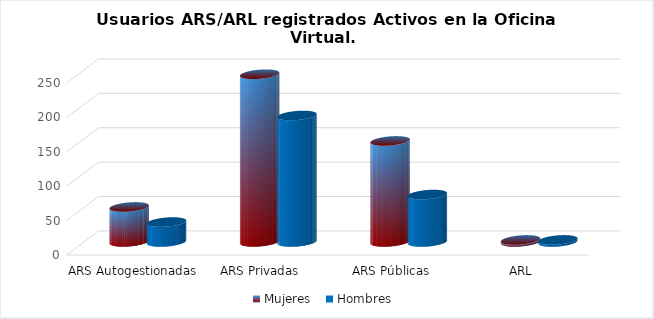
| Category | Mujeres | Hombres |
|---|---|---|
| ARS Autogestionadas | 51 | 29 |
| ARS Privadas | 244 | 184 |
| ARS Públicas | 147 | 69 |
| ARL | 3 | 3 |